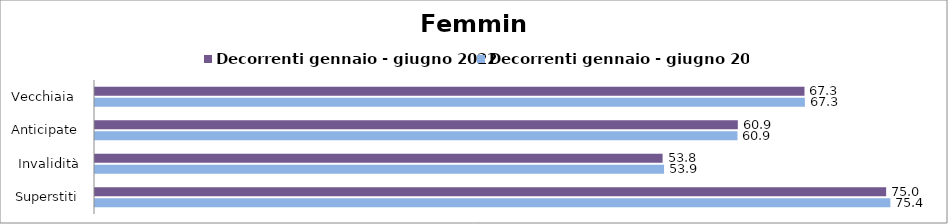
| Category | Decorrenti gennaio - giugno 2022 | Decorrenti gennaio - giugno 2023 |
|---|---|---|
| Vecchiaia  | 67.25 | 67.29 |
| Anticipate | 60.93 | 60.9 |
| Invalidità | 53.8 | 53.94 |
| Superstiti | 74.99 | 75.39 |